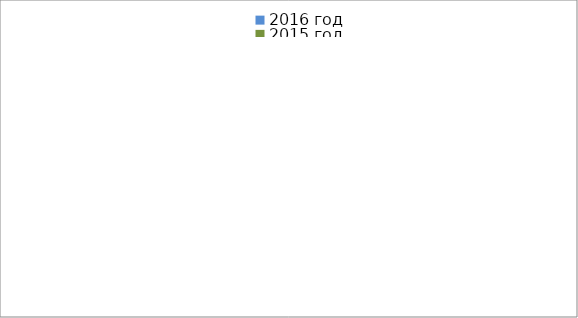
| Category | 2016 год | 2015 год |
|---|---|---|
|  - поджог | 6 | 0 |
|  - неосторожное обращение с огнём | 6 | 8 |
|  - НПТЭ электрооборудования | 0 | 1 |
|  - НПУ и Э печей | 8 | 6 |
|  - НПУ и Э транспортных средств | 6 | 10 |
|   -Шалость с огнем детей | 1 | 0 |
|  -НППБ при эксплуатации эл.приборов | 0 | 4 |
|  - курение | 0 | 1 |
| - прочие | 9 | 11 |
| - не установленные причины | 3 | 1 |